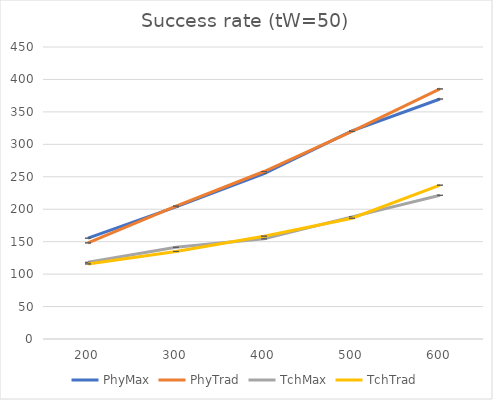
| Category | PhyMax | PhyTrad | TchMax | TchTrad |
|---|---|---|---|---|
| 200.0 | 155.379 | 148.146 | 118.135 | 115.689 |
| 300.0 | 203.737 | 204.789 | 141.319 | 134.94 |
| 400.0 | 255.009 | 258.105 | 154.388 | 158.429 |
| 500.0 | 320.85 | 319.991 | 188.241 | 186.054 |
| 600.0 | 369.821 | 385.394 | 221.436 | 237.04 |